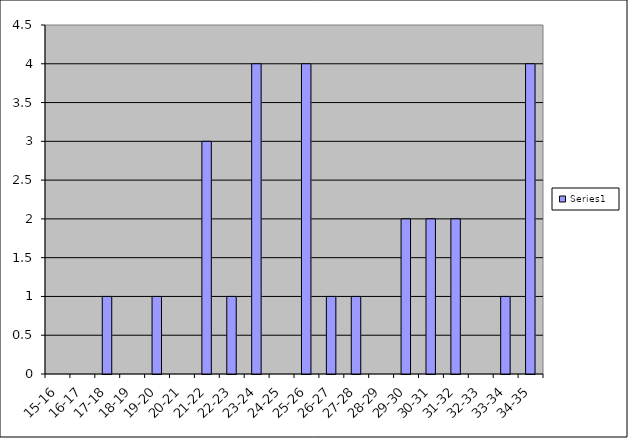
| Category | Series 0 |
|---|---|
| 15-16 | 0 |
| 16-17 | 0 |
| 17-18 | 1 |
| 18-19 | 0 |
| 19-20 | 1 |
| 20-21 | 0 |
| 21-22 | 3 |
| 22-23 | 1 |
| 23-24 | 4 |
| 24-25 | 0 |
| 25-26 | 4 |
| 26-27 | 1 |
| 27-28 | 1 |
| 28-29 | 0 |
| 29-30 | 2 |
| 30-31 | 2 |
| 31-32 | 2 |
| 32-33 | 0 |
| 33-34 | 1 |
| 34-35 | 4 |